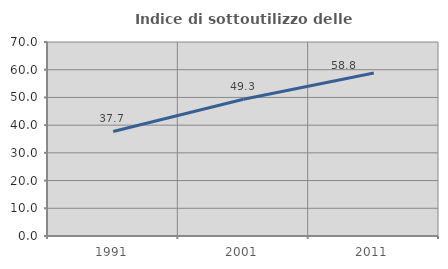
| Category | Indice di sottoutilizzo delle abitazioni  |
|---|---|
| 1991.0 | 37.731 |
| 2001.0 | 49.321 |
| 2011.0 | 58.837 |